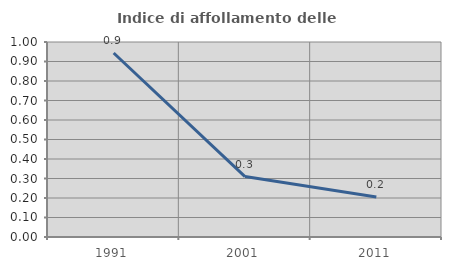
| Category | Indice di affollamento delle abitazioni  |
|---|---|
| 1991.0 | 0.944 |
| 2001.0 | 0.31 |
| 2011.0 | 0.205 |